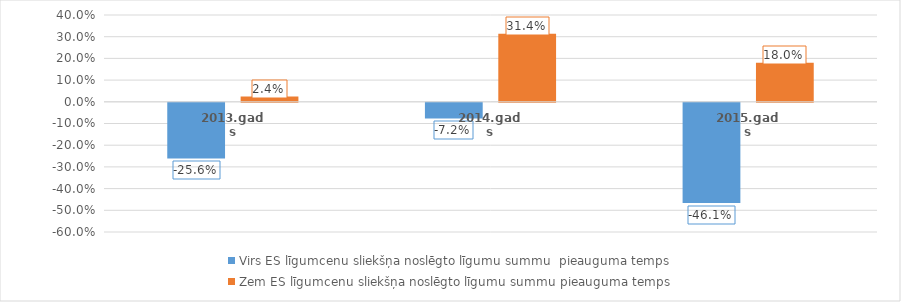
| Category | Virs ES līgumcenu sliekšņa noslēgto līgumu summu  pieauguma temps | Zem ES līgumcenu sliekšņa noslēgto līgumu summu pieauguma temps |
|---|---|---|
| 2013.gads | -0.256 | 0.024 |
| 2014.gads | -0.072 | 0.314 |
| 2015.gads | -0.461 | 0.18 |